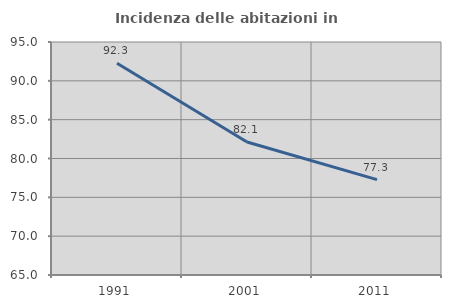
| Category | Incidenza delle abitazioni in proprietà  |
|---|---|
| 1991.0 | 92.264 |
| 2001.0 | 82.124 |
| 2011.0 | 77.285 |